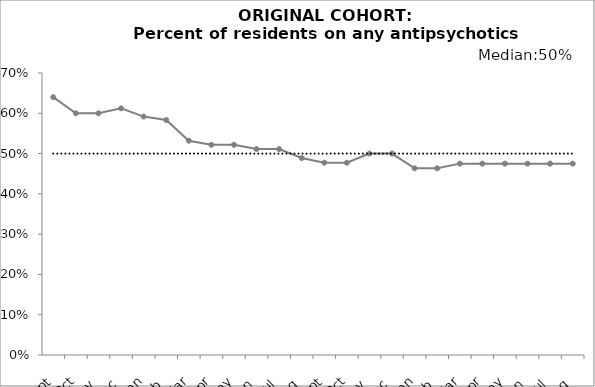
| Category | Total Use | Median |
|---|---|---|
| 2015-09-01 | 0.64 | 0.5 |
| 2015-10-01 | 0.6 | 0.5 |
| 2015-11-01 | 0.6 | 0.5 |
| 2015-12-01 | 0.612 | 0.5 |
| 2016-01-01 | 0.592 | 0.5 |
| 2016-02-01 | 0.583 | 0.5 |
| 2016-03-01 | 0.532 | 0.5 |
| 2016-04-01 | 0.522 | 0.5 |
| 2016-05-01 | 0.522 | 0.5 |
| 2016-06-01 | 0.511 | 0.5 |
| 2016-07-01 | 0.511 | 0.5 |
| 2016-08-01 | 0.489 | 0.5 |
| 2016-09-01 | 0.477 | 0.5 |
| 2016-10-01 | 0.477 | 0.5 |
| 2016-11-01 | 0.5 | 0.5 |
| 2016-12-01 | 0.5 | 0.5 |
| 2017-01-01 | 0.463 | 0.5 |
| 2017-02-01 | 0.463 | 0.5 |
| 2017-03-01 | 0.475 | 0.5 |
| 2017-04-01 | 0.475 | 0.5 |
| 2017-05-01 | 0.475 | 0.5 |
| 2017-06-01 | 0.475 | 0.5 |
| 2017-07-01 | 0.475 | 0.5 |
| 2017-08-01 | 0.475 | 0.5 |